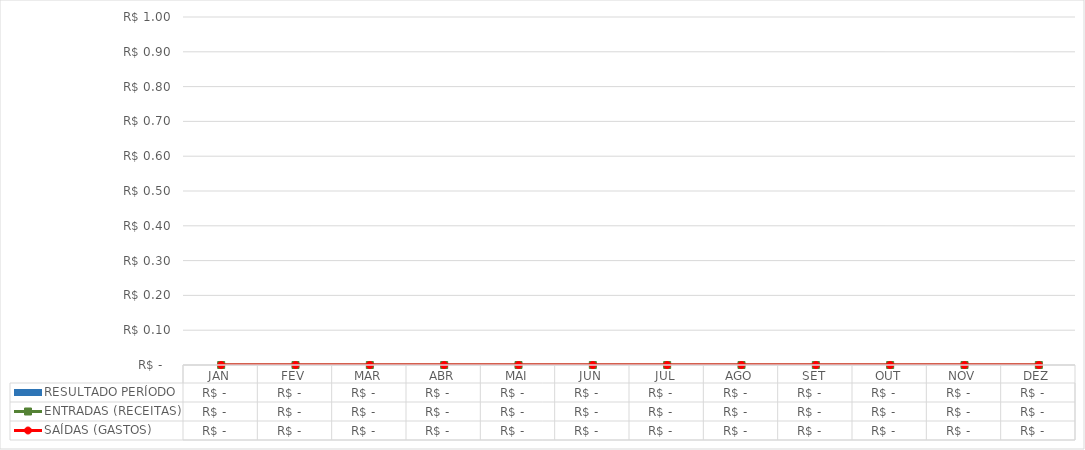
| Category | RESULTADO PERÍODO |
|---|---|
|  JAN  | 0 |
|  FEV  | 0 |
|  MAR  | 0 |
|  ABR  | 0 |
|  MAI  | 0 |
|  JUN  | 0 |
|  JUL  | 0 |
|  AGO  | 0 |
|  SET  | 0 |
|  OUT  | 0 |
|  NOV  | 0 |
|  DEZ  | 0 |